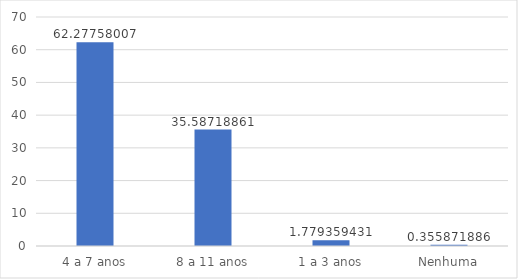
| Category | Series 0 |
|---|---|
| 4 a 7 anos | 62.278 |
| 8 a 11 anos | 35.587 |
| 1 a 3 anos | 1.779 |
| Nenhuma | 0.356 |